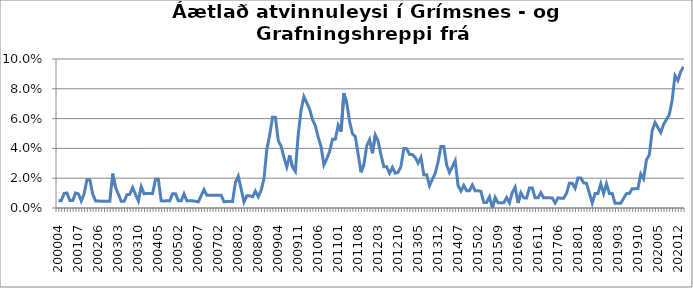
| Category | Series 0 |
|---|---|
| 200004 | 0.005 |
| 200005 | 0.005 |
| 200006 | 0.01 |
| 200007 | 0.01 |
| 200011 | 0.005 |
| 200012 | 0.005 |
| 200106 | 0.01 |
| 200107 | 0.009 |
| 200108 | 0.005 |
| 200112 | 0.009 |
| 200201 | 0.019 |
| 200202 | 0.019 |
| 200203 | 0.009 |
| 200204 | 0.005 |
| 200206 | 0.005 |
| 200207 | 0.004 |
| 200210 | 0.004 |
| 200211 | 0.004 |
| 200212 | 0.004 |
| 200301 | 0.023 |
| 200302 | 0.014 |
| 200303 | 0.009 |
| 200304 | 0.004 |
| 200305 | 0.004 |
| 200306 | 0.009 |
| 200307 | 0.009 |
| 200308 | 0.014 |
| 200309 | 0.009 |
| 200310 | 0.005 |
| 200311 | 0.014 |
| 200312 | 0.01 |
| 200401 | 0.01 |
| 200402 | 0.01 |
| 200403 | 0.01 |
| 200404 | 0.019 |
| 200405 | 0.019 |
| 200406 | 0.005 |
| 200409 | 0.005 |
| 200410 | 0.005 |
| 200411 | 0.005 |
| 200412 | 0.01 |
| 200501 | 0.01 |
| 200502 | 0.005 |
| 200503 | 0.005 |
| 200504 | 0.009 |
| 200512 | 0.005 |
| 200602 | 0.005 |
| 200603 | 0.005 |
| 200606 | 0.005 |
| 200607 | 0.004 |
| 200608 | 0.008 |
| 200609 | 0.012 |
| 200610 | 0.009 |
| 200611 | 0.009 |
| 200612 | 0.009 |
| 200701 | 0.009 |
| 200702 | 0.009 |
| 200703 | 0.009 |
| 200704 | 0.004 |
| 200710 | 0.004 |
| 200711 | 0.004 |
| 200712 | 0.004 |
| 200801 | 0.017 |
| 200802 | 0.021 |
| 200803 | 0.013 |
| 200804 | 0.004 |
| 200805 | 0.008 |
| 200806 | 0.008 |
| 200807 | 0.008 |
| 200808 | 0.011 |
| 200809 | 0.008 |
| 200810 | 0.012 |
| 200811 | 0.02 |
| 200812 | 0.039 |
| 200901 | 0.049 |
| 200902 | 0.061 |
| 200903 | 0.061 |
| 200904 | 0.045 |
| 200905 | 0.042 |
| 200906 | 0.034 |
| 200907 | 0.027 |
| 200908 | 0.035 |
| 200909 | 0.027 |
| 200910 | 0.025 |
| 200911 | 0.049 |
| 200912 | 0.066 |
| 201001 | 0.075 |
| 201002 | 0.071 |
| 201003 | 0.066 |
| 201004 | 0.059 |
| 201005 | 0.055 |
| 201006 | 0.047 |
| 201007 | 0.041 |
| 201008 | 0.029 |
| 201009 | 0.033 |
| 201010 | 0.038 |
| 201011 | 0.046 |
| 201012 | 0.046 |
| 201101 | 0.056 |
| 201102 | 0.051 |
| 201103 | 0.077 |
| 201104 | 0.071 |
| 201105 | 0.058 |
| 201106 | 0.05 |
| 201107 | 0.048 |
| 201108 | 0.036 |
| 201109 | 0.024 |
| 201110 | 0.029 |
| 201111 | 0.042 |
| 201112 | 0.046 |
| 201201 | 0.037 |
| 201202 | 0.049 |
| 201203 | 0.045 |
| 201204 | 0.036 |
| 201205 | 0.028 |
| 201206 | 0.028 |
| 201207 | 0.023 |
| 201208 | 0.027 |
| 201209 | 0.023 |
| 201210 | 0.024 |
| 201211 | 0.028 |
| 201212 | 0.04 |
| 201301 | 0.04 |
| 201302 | 0.036 |
| 201303 | 0.036 |
| 201304 | 0.034 |
| 201305 | 0.03 |
| 201306 | 0.034 |
| 201307 | 0.022 |
| 201308 | 0.022 |
| 201309 | 0.015 |
| 201310 | 0.019 |
| 201311 | 0.023 |
| 201312 | 0.031 |
| 201401 | 0.041 |
| 201402 | 0.041 |
| 201403 | 0.029 |
| 201404 | 0.024 |
| 201405 | 0.028 |
| 201406 | 0.032 |
| 201407 | 0.015 |
| 201408 | 0.011 |
| 201409 | 0.015 |
| 201410 | 0.012 |
| 201411 | 0.012 |
| 201412 | 0.015 |
| 201501 | 0.012 |
| 201502 | 0.012 |
| 201503 | 0.011 |
| 201504 | 0.004 |
| 201505 | 0.004 |
| 201506 | 0.007 |
| 201507 | 0 |
| 201508 | 0.007 |
| 201509 | 0.004 |
| 201510 | 0.003 |
| 201511 | 0.003 |
| 201512 | 0.007 |
| 201601 | 0.003 |
| 201602 | 0.01 |
| 201603 | 0.014 |
| 201604 | 0.003 |
| 201605 | 0.01 |
| 201606 | 0.007 |
| 201607 | 0.007 |
| 201608 | 0.013 |
| 201609 | 0.013 |
| 201610 | 0.007 |
| 201611 | 0.007 |
| 201612 | 0.01 |
| 201701 | 0.007 |
| 201702 | 0.007 |
| 201703 | 0.007 |
| 201704 | 0.007 |
| 201705 | 0.003 |
| 201706 | 0.007 |
| 201707 | 0.007 |
| 201708 | 0.007 |
| 201709 | 0.01 |
| 201710 | 0.017 |
| 201711 | 0.017 |
| 201712 | 0.013 |
| 201801 | 0.02 |
| 201802 | 0.02 |
| 201803 | 0.017 |
| 201804 | 0.017 |
| 201805 | 0.01 |
| 201806 | 0.003 |
| 201807 | 0.01 |
| 201808 | 0.01 |
| 201809 | 0.016 |
| 201810 | 0.01 |
| 201811 | 0.016 |
| 201812 | 0.01 |
| 201901 | 0.01 |
| 201902 | 0.003 |
| 201903 | 0.003 |
| 201904 | 0.003 |
| 201905 | 0.006 |
| 201906 | 0.01 |
| 201907 | 0.01 |
| 201908 | 0.013 |
| 201909 | 0.013 |
| 201910 | 0.013 |
| 201911 | 0.023 |
| 201912 | 0.02 |
| 202001 | 0.032 |
| 202002 | 0.036 |
| 202003 | 0.052 |
| 202004 | 0.057 |
| 202005 | 0.054 |
| 202006 | 0.051 |
| 202007 | 0.056 |
| 202008 | 0.059 |
| 202009 | 0.063 |
| 202010 | 0.072 |
| 202011 | 0.089 |
| 202012 | 0.086 |
| 202101 | 0.092 |
| 202102 | 0.095 |